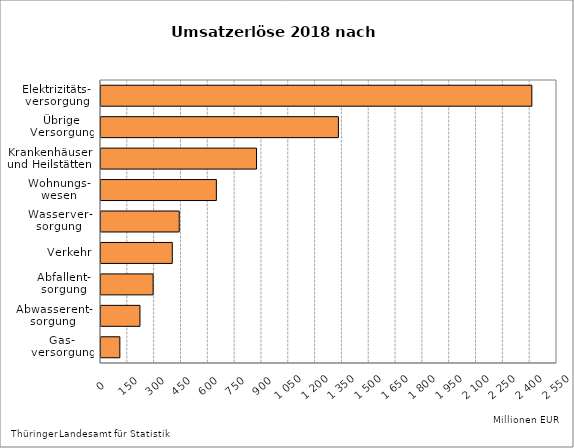
| Category | Series 1 |
|---|---|
| Gas-
versorgung | 105.441 |
| Abwasserent-
sorgung | 217.879 |
| Abfallent-
sorgung | 291.463 |
| Verkehr | 398.697 |
| Wasserver-
sorgung | 437.489 |
| Wohnungs-
wesen | 645.121 |
| Krankenhäuser
und Heilstätten | 869.749 |
| Übrige
Versorgung | 1327.595 |
| Elektrizitäts-
versorgung | 2409.236 |